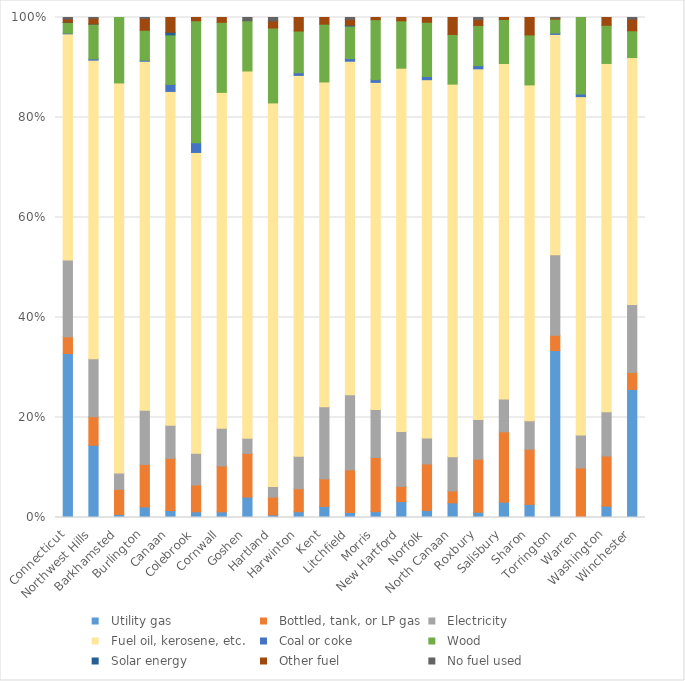
| Category |   Utility gas |   Bottled, tank, or LP gas |   Electricity |   Fuel oil, kerosene, etc. |   Coal or coke |   Wood |   Solar energy |   Other fuel |   No fuel used |
|---|---|---|---|---|---|---|---|---|---|
| Connecticut | 444864 | 45208 | 208309 | 613504 | 1626 | 29250 | 475 | 9122 | 3848 |
| Northwest Hills | 6694 | 2644 | 5382 | 27656 | 115 | 3228 | 9 | 535 | 65 |
| Barkhamsted | 9 | 74 | 48 | 1151 | 0 | 193 | 0 | 0 | 0 |
| Burlington | 72 | 287 | 367 | 2359 | 7 | 203 | 0 | 80 | 6 |
| Canaan | 8 | 60 | 38 | 384 | 8 | 57 | 3 | 17 | 0 |
| Colebrook | 7 | 33 | 39 | 370 | 12 | 150 | 0 | 4 | 0 |
| Cornwall | 7 | 57 | 47 | 417 | 0 | 87 | 0 | 6 | 0 |
| Goshen | 50 | 107 | 37 | 900 | 0 | 123 | 0 | 0 | 8 |
| Hartland | 4 | 27 | 16 | 584 | 0 | 114 | 0 | 11 | 5 |
| Harwinton | 24 | 95 | 135 | 1578 | 11 | 173 | 0 | 56 | 0 |
| Kent | 25 | 62 | 162 | 731 | 0 | 130 | 0 | 15 | 0 |
| Litchfield | 35 | 294 | 519 | 2304 | 18 | 225 | 6 | 40 | 13 |
| Morris | 11 | 100 | 89 | 605 | 5 | 111 | 0 | 4 | 0 |
| New Hartford | 86 | 82 | 297 | 1963 | 0 | 256 | 0 | 18 | 0 |
| Norfolk | 9 | 59 | 33 | 455 | 4 | 69 | 0 | 6 | 0 |
| North Canaan | 38 | 31 | 89 | 967 | 0 | 129 | 0 | 44 | 0 |
| Roxbury | 10 | 100 | 75 | 663 | 6 | 76 | 0 | 11 | 4 |
| Salisbury | 46 | 211 | 98 | 1006 | 0 | 132 | 0 | 6 | 0 |
| Sharon | 33 | 139 | 72 | 847 | 0 | 126 | 0 | 44 | 0 |
| Torrington | 4950 | 450 | 2391 | 6528 | 41 | 410 | 0 | 36 | 14 |
| Warren | 0 | 57 | 38 | 389 | 3 | 88 | 0 | 0 | 0 |
| Washington | 35 | 155 | 137 | 1076 | 0 | 118 | 0 | 24 | 0 |
| Winchester | 1235 | 164 | 655 | 2379 | 0 | 258 | 0 | 113 | 15 |